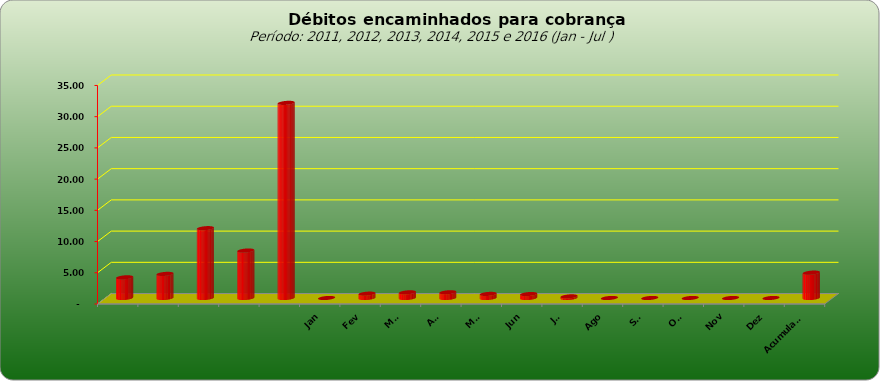
| Category |  3.309.443,02  |
|---|---|
|  | 3309443.02 |
|  | 3859728.44 |
|  | 11181928.25 |
|  | 7600526.01 |
|  | 31248623.5 |
| Jan | 0 |
| Fev | 695716.82 |
| Mar | 906394.22 |
| Abr | 915013.51 |
| Mai | 654375.79 |
| Jun | 631930.49 |
| Jul | 259089.26 |
| Ago | 0 |
| Set | 0 |
| Out | 0 |
| Nov | 0 |
| Dez | 0 |
| Acumulado | 4062520.09 |